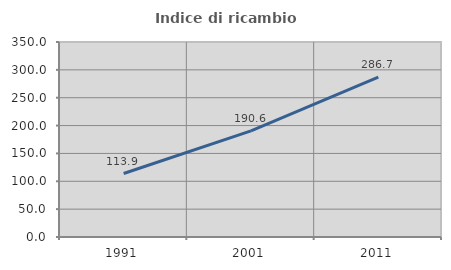
| Category | Indice di ricambio occupazionale  |
|---|---|
| 1991.0 | 113.924 |
| 2001.0 | 190.602 |
| 2011.0 | 286.747 |